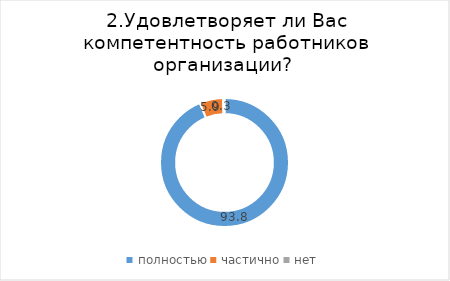
| Category | Series 0 |
|---|---|
| полностью | 93.75 |
| частично | 5.921 |
| нет | 0.329 |